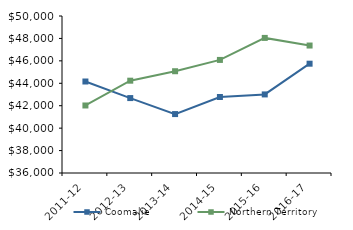
| Category | Coomalie | Northern Territory |
|---|---|---|
| 2011-12 | 44159 | 42021 |
| 2012-13 | 42681.07 | 44232.02 |
| 2013-14 | 41254.59 | 45075.51 |
| 2014-15 | 42779 | 46083.65 |
| 2015-16 | 43007.5 | 48046.27 |
| 2016-17 | 45746.67 | 47367.05 |